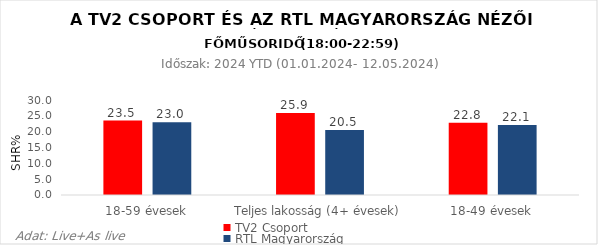
| Category | TV2 Csoport | RTL Magyarország |
|---|---|---|
| 18-59 évesek | 23.5 | 23 |
| Teljes lakosság (4+ évesek) | 25.9 | 20.5 |
| 18-49 évesek | 22.8 | 22.1 |